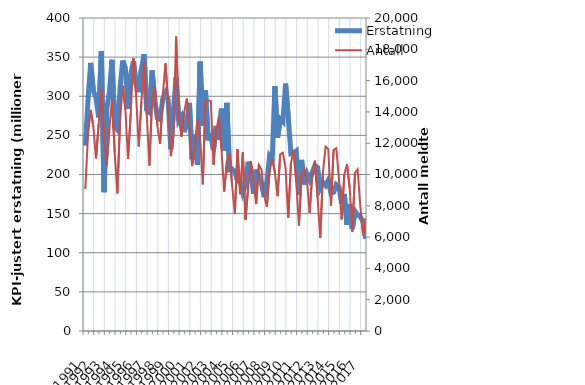
| Category | Erstatning |
|---|---|
| 1991.0 | 236.93 |
| nan | 294.783 |
| nan | 342.604 |
| nan | 306.85 |
| 1992.0 | 298.702 |
| nan | 272.93 |
| nan | 357.674 |
| nan | 177.392 |
| 1993.0 | 282.989 |
| nan | 304.909 |
| nan | 346.657 |
| nan | 261.754 |
| 1994.0 | 257.298 |
| nan | 309.812 |
| nan | 345.57 |
| nan | 335.26 |
| 1995.0 | 283.864 |
| nan | 328.377 |
| nan | 344.843 |
| nan | 315.774 |
| 1996.0 | 305.279 |
| nan | 335.126 |
| nan | 353.585 |
| nan | 282.683 |
| 1997.0 | 279.48 |
| nan | 332.877 |
| nan | 294.639 |
| nan | 272.383 |
| 1998.0 | 270.352 |
| nan | 296.571 |
| nan | 304.109 |
| nan | 295.927 |
| 1999.0 | 232.48 |
| nan | 282.091 |
| nan | 324.198 |
| nan | 268.894 |
| 2000.0 | 274.096 |
| nan | 254.192 |
| nan | 266.636 |
| nan | 291.498 |
| 2001.0 | 219.204 |
| nan | 251.418 |
| nan | 212.311 |
| nan | 344.35 |
| 2002.0 | 262.177 |
| nan | 307.371 |
| nan | 243.755 |
| nan | 253.074 |
| 2003.0 | 231.225 |
| nan | 262.007 |
| nan | 244.31 |
| nan | 284.07 |
| 2004.0 | 230.06 |
| nan | 291.643 |
| nan | 206.052 |
| nan | 206.912 |
| 2005.0 | 203.382 |
| nan | 191.684 |
| nan | 192.48 |
| nan | 177.255 |
| 2006.0 | 187.023 |
| nan | 216.279 |
| nan | 206.275 |
| nan | 175.342 |
| 2007.0 | 206.294 |
| nan | 197.065 |
| nan | 187.945 |
| nan | 171.171 |
| 2008.0 | 190.176 |
| nan | 223.609 |
| nan | 219.141 |
| nan | 313.056 |
| 2009.0 | 246.971 |
| nan | 271.054 |
| nan | 267.661 |
| nan | 316.135 |
| 2010.0 | 273.511 |
| nan | 226.468 |
| nan | 227.397 |
| nan | 230.109 |
| 2011.0 | 174.049 |
| nan | 218.637 |
| nan | 187.211 |
| nan | 200.949 |
| 2012.0 | 193.218 |
| nan | 202.53 |
| nan | 211.663 |
| nan | 208.882 |
| 2013.0 | 182.74 |
| nan | 189.941 |
| nan | 186.037 |
| nan | 192.746 |
| 2014.0 | 176.109 |
| nan | 177.235 |
| nan | 187.111 |
| nan | 184.198 |
| 2015.0 | 162.554 |
| nan | 175.142 |
| nan | 135.952 |
| nan | 162.027 |
| 2016.0 | 130.485 |
| nan | 153.144 |
| nan | 148.639 |
| nan | 145.95 |
| 2017.0 | 139.586 |
| nan | 117.83 |